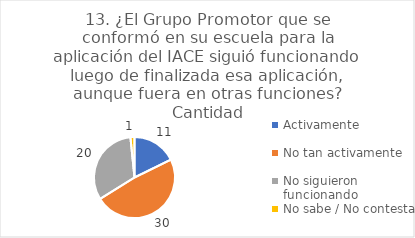
| Category | 13. ¿El Grupo Promotor que se conformó en su escuela para la aplicación del IACE siguió funcionando luego de finalizada esa aplicación, aunque fuera en otras funciones? |
|---|---|
| Activamente  | 0.177 |
| No tan activamente  | 0.484 |
| No siguieron funcionando  | 0.323 |
| No sabe / No contesta | 0.016 |